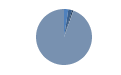
| Category | Series 0 |
|---|---|
| ARRASTRE | 68 |
| CERCO | 58 |
| PALANGRE | 22 |
| REDES DE ENMALLE | 2 |
| ARTES FIJAS | 1 |
| ARTES MENORES | 2579 |